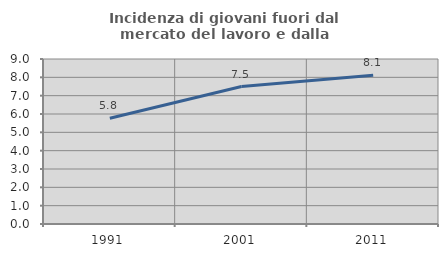
| Category | Incidenza di giovani fuori dal mercato del lavoro e dalla formazione  |
|---|---|
| 1991.0 | 5.769 |
| 2001.0 | 7.5 |
| 2011.0 | 8.108 |